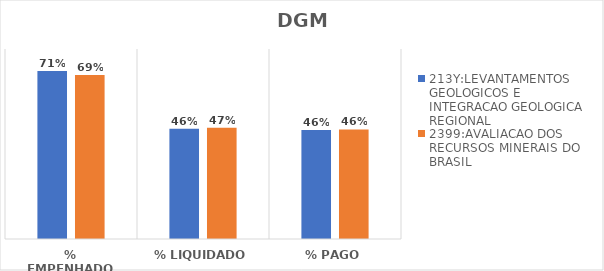
| Category | 213Y:LEVANTAMENTOS GEOLOGICOS E INTEGRACAO GEOLOGICA REGIONAL | 2399:AVALIACAO DOS RECURSOS MINERAIS DO BRASIL |
|---|---|---|
| % EMPENHADO | 0.707 | 0.69 |
| % LIQUIDADO | 0.465 | 0.468 |
| % PAGO | 0.459 | 0.462 |